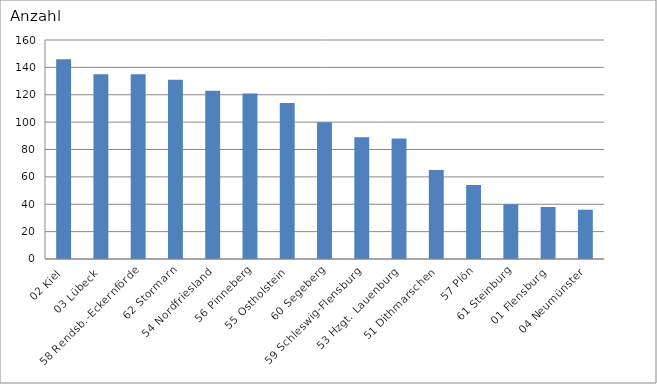
| Category | 02 Kiel 03 Lübeck 58 Rendsb.-Eckernförde 62 Stormarn 54 Nordfriesland 56 Pinneberg 55 Ostholstein 60 Segeberg 59 Schleswig-Flensburg 53 Hzgt. Lauenburg 51 Dithmarschen 57 Plön 61 Steinburg 01 Flensburg 04 Neumünster |
|---|---|
| 02 Kiel | 146 |
| 03 Lübeck | 135 |
| 58 Rendsb.-Eckernförde | 135 |
| 62 Stormarn | 131 |
| 54 Nordfriesland | 123 |
| 56 Pinneberg | 121 |
| 55 Ostholstein | 114 |
| 60 Segeberg | 100 |
| 59 Schleswig-Flensburg | 89 |
| 53 Hzgt. Lauenburg | 88 |
| 51 Dithmarschen | 65 |
| 57 Plön | 54 |
| 61 Steinburg | 40 |
| 01 Flensburg | 38 |
| 04 Neumünster | 36 |